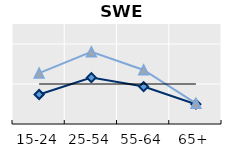
| Category | Né à l'étranger | Né dans le pays | Series 1 |
|---|---|---|---|
| 15-24 | 0.737 | 1.271 | 1 |
| 25-54 | 1.159 | 1.803 | 1 |
| 55-64 | 0.936 | 1.351 | 1 |
| 65+ | 0.496 | 0.515 | 1 |